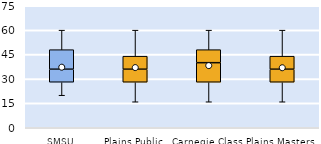
| Category | 25th | 50th | 75th |
|---|---|---|---|
| SMSU | 28 | 8 | 12 |
| Plains Public | 28 | 8 | 8 |
| Carnegie Class | 28 | 12 | 8 |
| Plains Masters | 28 | 8 | 8 |